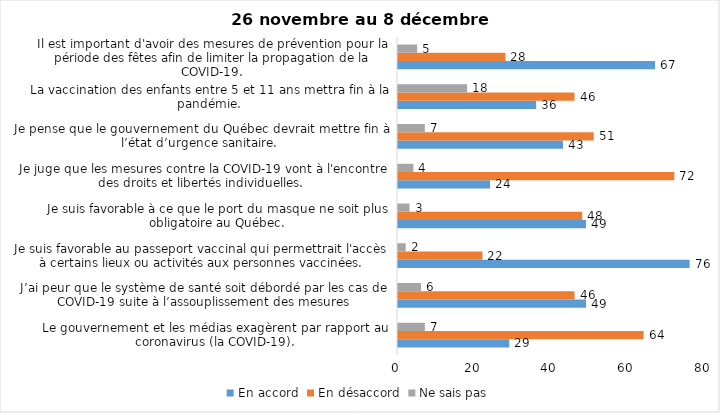
| Category | En accord | En désaccord | Ne sais pas |
|---|---|---|---|
| Le gouvernement et les médias exagèrent par rapport au coronavirus (la COVID-19). | 29 | 64 | 7 |
| J’ai peur que le système de santé soit débordé par les cas de COVID-19 suite à l’assouplissement des mesures | 49 | 46 | 6 |
| Je suis favorable au passeport vaccinal qui permettrait l'accès à certains lieux ou activités aux personnes vaccinées. | 76 | 22 | 2 |
| Je suis favorable à ce que le port du masque ne soit plus obligatoire au Québec. | 49 | 48 | 3 |
| Je juge que les mesures contre la COVID-19 vont à l'encontre des droits et libertés individuelles.  | 24 | 72 | 4 |
| Je pense que le gouvernement du Québec devrait mettre fin à l’état d’urgence sanitaire.  | 43 | 51 | 7 |
| La vaccination des enfants entre 5 et 11 ans mettra fin à la pandémie. | 36 | 46 | 18 |
| Il est important d'avoir des mesures de prévention pour la période des fêtes afin de limiter la propagation de la COVID-19. | 67 | 28 | 5 |